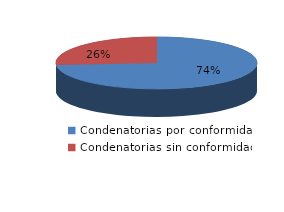
| Category | Series 0 |
|---|---|
| 0 | 1103 |
| 1 | 394 |